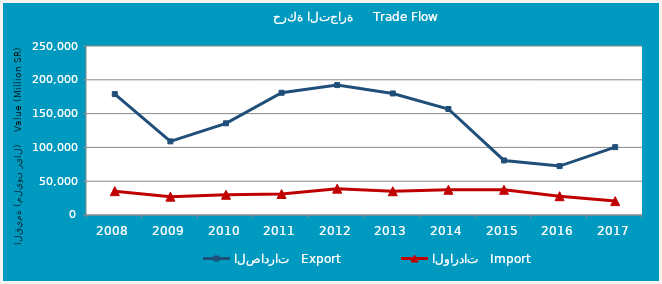
| Category | الصادرات   Export | الواردات   Import |
|---|---|---|
| 2008.0 | 178822715246 | 35250854628 |
| 2009.0 | 108955562791 | 27142030403 |
| 2010.0 | 135633964803 | 29956530408 |
| 2011.0 | 180828030890 | 31064897876 |
| 2012.0 | 192201479929 | 38988506822 |
| 2013.0 | 179825355732 | 35153452131 |
| 2014.0 | 156821228290 | 37306115946 |
| 2015.0 | 80682659035 | 37286013756 |
| 2016.0 | 72342363619 | 27820758728 |
| 2017.0 | 100382168817 | 20568996431 |